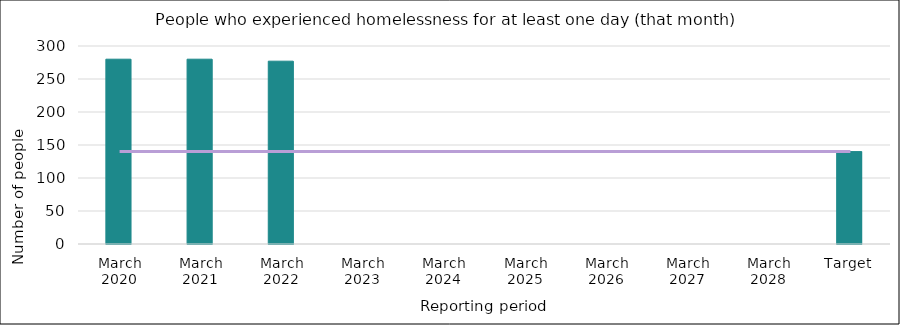
| Category | Series 0 |
|---|---|
| March 2020 | 280 |
| March 2021 | 280 |
| March 2022 | 277 |
| March 2023 | 0 |
| March 2024 | 0 |
| March 2025 | 0 |
| March 2026 | 0 |
| March 2027 | 0 |
| March 2028 | 0 |
| Target | 140 |